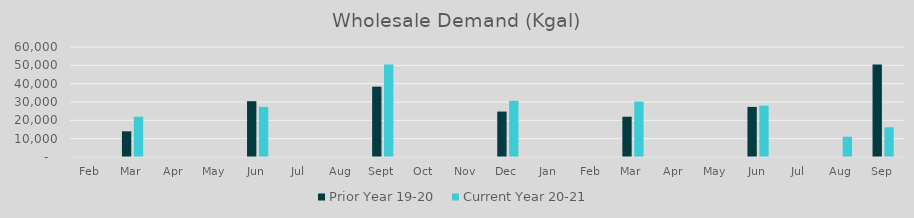
| Category | Prior Year 19-20  | Current Year 20-21 |
|---|---|---|
| Feb | 0 | 0 |
| Mar | 14013.78 | 21965.02 |
| Apr | 0 | 0 |
| May | 0 | 0 |
| Jun | 30443.6 | 27331 |
| Jul | 0 | 0 |
| Aug | 0 | 0 |
| Sep | 38376.14 | 50400.24 |
| Oct | 0 | 0 |
| Nov | 0 | 0 |
| Dec | 24784.98 | 30611.9 |
| Jan | 0 | 0 |
| Feb | 0 | 0 |
| Mar | 21965.02 | 30196.76 |
| Apr | 0 | 0 |
| May | 0 | 0 |
| Jun | 27331 | 27993.9 |
| Jul | 0 | 0 |
| Aug | 0 | 11056.179 |
| Sep | 50400.24 | 16202.763 |